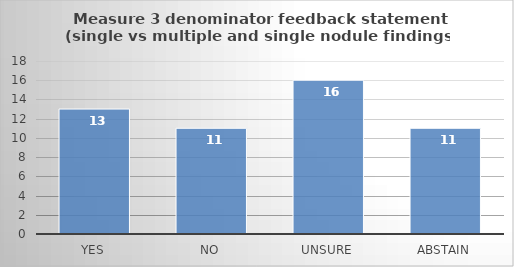
| Category | Series 0 |
|---|---|
| Yes | 13 |
| No | 11 |
| Unsure | 16 |
| Abstain | 11 |